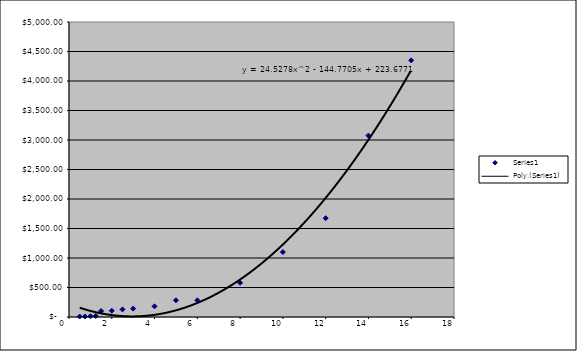
| Category | Series 0 |
|---|---|
| 0.5 | 7.75 |
| 0.75 | 9.45 |
| 1.0 | 12.9 |
| 1.25 | 17.2 |
| 1.5 | 101 |
| 2.0 | 106 |
| 2.5 | 128 |
| 3.0 | 142 |
| 4.0 | 181 |
| 5.0 | 283 |
| 6.0 | 283 |
| 8.0 | 580 |
| 10.0 | 1100 |
| 12.0 | 1675 |
| 14.0 | 3075 |
| 16.0 | 4350 |